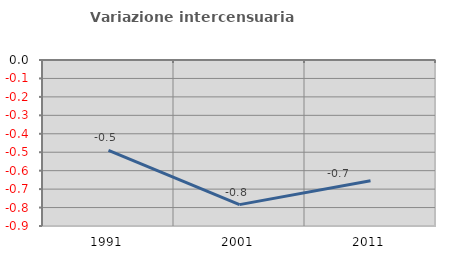
| Category | Variazione intercensuaria annua |
|---|---|
| 1991.0 | -0.489 |
| 2001.0 | -0.784 |
| 2011.0 | -0.654 |